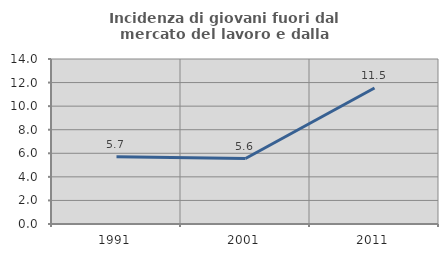
| Category | Incidenza di giovani fuori dal mercato del lavoro e dalla formazione  |
|---|---|
| 1991.0 | 5.714 |
| 2001.0 | 5.556 |
| 2011.0 | 11.538 |